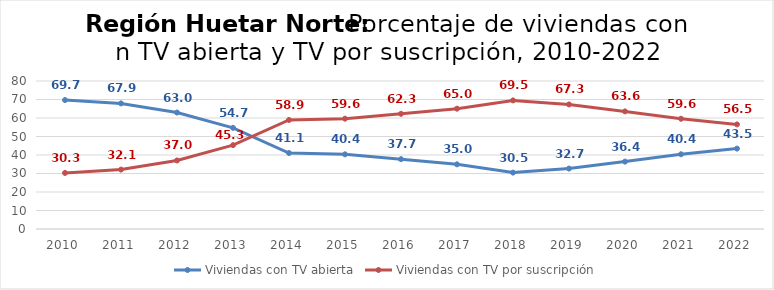
| Category | Viviendas con TV abierta | Viviendas con TV por suscripción |
|---|---|---|
| 2010.0 | 69.692 | 30.308 |
| 2011.0 | 67.886 | 32.114 |
| 2012.0 | 62.959 | 37.041 |
| 2013.0 | 54.682 | 45.318 |
| 2014.0 | 41.073 | 58.927 |
| 2015.0 | 40.363 | 59.637 |
| 2016.0 | 37.74 | 62.26 |
| 2017.0 | 34.951 | 65.049 |
| 2018.0 | 30.484 | 69.516 |
| 2019.0 | 32.672 | 67.328 |
| 2020.0 | 36.43 | 63.57 |
| 2021.0 | 40.397 | 59.603 |
| 2022.0 | 43.458 | 56.542 |